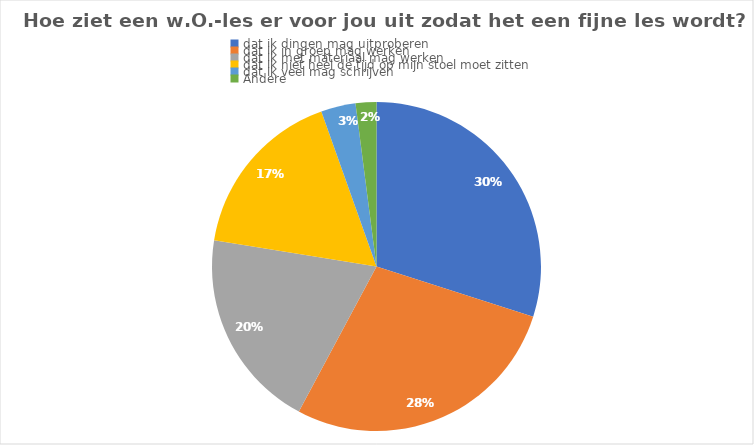
| Category | Series 0 |
|---|---|
| dat ik dingen mag uitproberen | 44 |
| dat ik in groep mag werken | 41 |
| dat ik met materiaal mag werken | 29 |
| dat ik niet heel de tijd op mijn stoel moet zitten | 25 |
| dat ik veel mag schrijven | 5 |
| Andere | 3 |